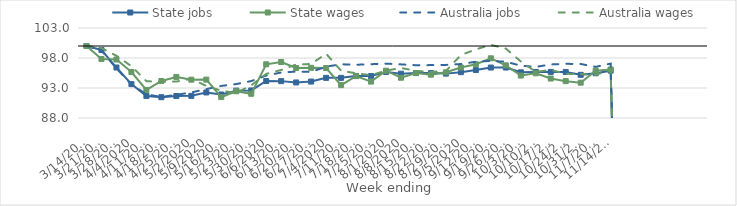
| Category | State jobs | State wages | Australia jobs | Australia wages |
|---|---|---|---|---|
| 14/03/2020 | 100 | 100 | 100 | 100 |
| 21/03/2020 | 99.332 | 97.844 | 99.252 | 99.658 |
| 28/03/2020 | 96.412 | 97.752 | 96.25 | 98.378 |
| 04/04/2020 | 93.646 | 95.656 | 93.61 | 96.634 |
| 11/04/2020 | 91.676 | 92.682 | 91.936 | 94.139 |
| 18/04/2020 | 91.466 | 94.172 | 91.515 | 94.01 |
| 25/04/2020 | 91.668 | 94.848 | 91.861 | 94.076 |
| 02/05/2020 | 91.692 | 94.383 | 92.263 | 94.531 |
| 09/05/2020 | 92.255 | 94.397 | 92.818 | 93.346 |
| 16/05/2020 | 91.914 | 91.486 | 93.348 | 92.542 |
| 23/05/2020 | 92.562 | 92.465 | 93.657 | 92.17 |
| 30/05/2020 | 92.594 | 92.035 | 94.157 | 93.446 |
| 06/06/2020 | 94.168 | 96.952 | 95.081 | 95.354 |
| 13/06/2020 | 94.145 | 97.333 | 95.581 | 96.009 |
| 20/06/2020 | 93.925 | 96.331 | 95.73 | 96.914 |
| 27/06/2020 | 94.072 | 96.366 | 95.677 | 96.999 |
| 04/07/2020 | 94.69 | 96.325 | 96.551 | 98.71 |
| 11/07/2020 | 94.692 | 93.479 | 96.956 | 95.878 |
| 18/07/2020 | 95.012 | 94.98 | 96.874 | 95.454 |
| 25/07/2020 | 94.994 | 94.069 | 96.966 | 95.136 |
| 01/08/2020 | 95.675 | 95.884 | 97.062 | 95.894 |
| 08/08/2020 | 95.384 | 94.71 | 96.936 | 96.337 |
| 15/08/2020 | 95.492 | 95.492 | 96.797 | 95.858 |
| 22/08/2020 | 95.489 | 95.218 | 96.815 | 95.687 |
| 29/08/2020 | 95.396 | 95.615 | 96.851 | 95.834 |
| 05/09/2020 | 95.639 | 96.418 | 96.995 | 98.49 |
| 12/09/2020 | 95.993 | 96.955 | 97.381 | 99.44 |
| 19/09/2020 | 96.41 | 97.948 | 97.514 | 100.193 |
| 26/09/2020 | 96.411 | 96.777 | 97.375 | 99.575 |
| 03/10/2020 | 95.612 | 95.071 | 96.725 | 97.427 |
| 10/10/2020 | 95.681 | 95.45 | 96.517 | 95.692 |
| 17/10/2020 | 95.686 | 94.575 | 96.926 | 96.016 |
| 24/10/2020 | 95.676 | 94.144 | 97.027 | 95.365 |
| 31/10/2020 | 95.196 | 93.886 | 97.003 | 95.32 |
| 07/11/2020 | 95.452 | 95.896 | 96.523 | 95.17 |
| 14/11/2020 | 95.893 | 96.083 | 97.067 | 96.091 |